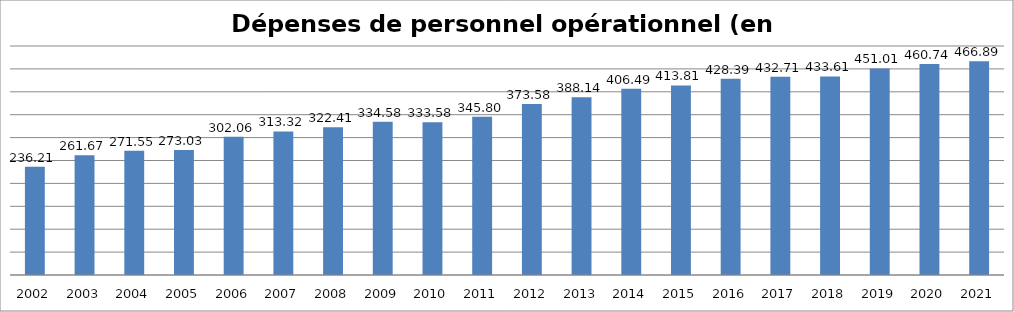
| Category | Series 0 |
|---|---|
| 2002.0 | 236214912.86 |
| 2003.0 | 261674978.07 |
| 2004.0 | 271547882.42 |
| 2005.0 | 273031976.66 |
| 2006.0 | 302057559.37 |
| 2007.0 | 313319845.11 |
| 2008.0 | 322406375.26 |
| 2009.0 | 334578969.77 |
| 2010.0 | 333582213.32 |
| 2011.0 | 345796124.56 |
| 2012.0 | 373575613.04 |
| 2013.0 | 388140686.23 |
| 2014.0 | 406490637.9 |
| 2015.0 | 413808389.87 |
| 2016.0 | 428392577.01 |
| 2017.0 | 432706568.43 |
| 2018.0 | 433607017.23 |
| 2019.0 | 451010932.72 |
| 2020.0 | 460744282.25 |
| 2021.0 | 466885761.241 |